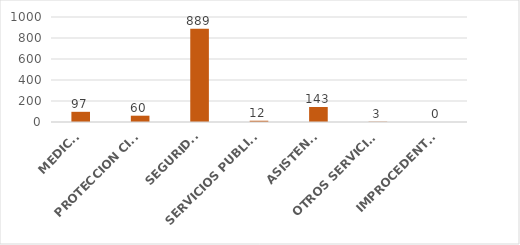
| Category | TOTAL |
|---|---|
| MEDICO | 97 |
| PROTECCION CIVIL | 60 |
| SEGURIDAD | 889 |
| SERVICIOS PUBLICOS | 12 |
| ASISTENCIA | 143 |
| OTROS SERVICIOS | 3 |
| IMPROCEDENTES | 0 |